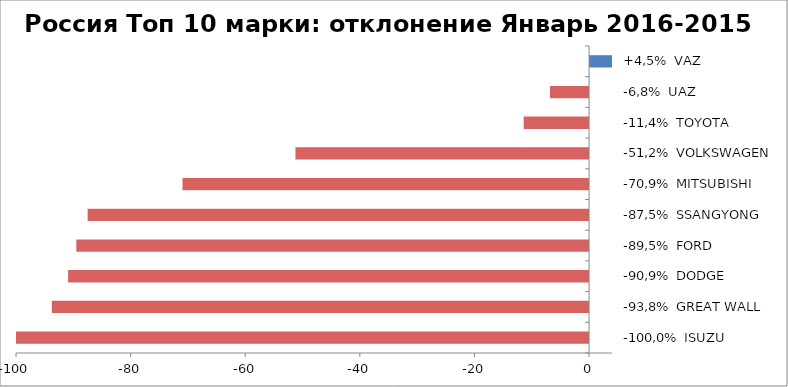
| Category | Россия Топ 10 марки: отклонение Январь 2016-2015 |
|---|---|
| -100,0%  ISUZU | -100 |
| -93,8%  GREAT WALL | -93.75 |
| -90,9%  DODGE | -90.909 |
| -89,5%  FORD | -89.474 |
| -87,5%  SSANGYONG | -87.5 |
| -70,9%  MITSUBISHI | -70.949 |
| -51,2%  VOLKSWAGEN | -51.24 |
| -11,4%  TOYOTA | -11.413 |
| -6,8%  UAZ | -6.818 |
| +4,5%  VAZ | 4.545 |